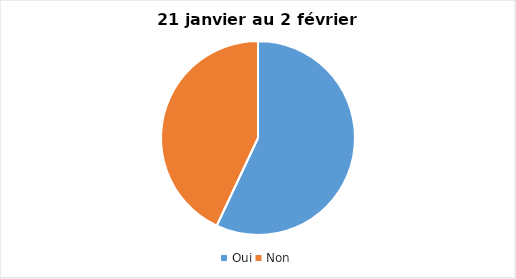
| Category | Series 0 |
|---|---|
| Oui | 57 |
| Non | 43 |